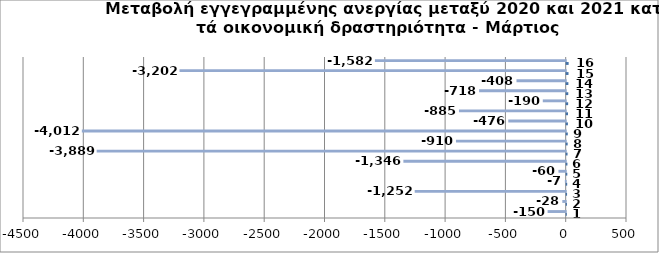
| Category | Series 0 | Series 1 |
|---|---|---|
| 0 | 1 | -150 |
| 1 | 2 | -28 |
| 2 | 3 | -1252 |
| 3 | 4 | -7 |
| 4 | 5 | -60 |
| 5 | 6 | -1346 |
| 6 | 7 | -3889 |
| 7 | 8 | -910 |
| 8 | 9 | -4012 |
| 9 | 10 | -476 |
| 10 | 11 | -885 |
| 11 | 12 | -190 |
| 12 | 13 | -718 |
| 13 | 14 | -408 |
| 14 | 15 | -3202 |
| 15 | 16 | -1582 |